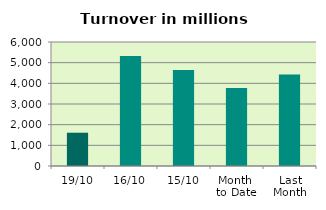
| Category | Series 0 |
|---|---|
| 19/10 | 1610.449 |
| 16/10 | 5327.782 |
| 15/10 | 4645.645 |
| Month 
to Date | 3777.999 |
| Last
Month | 4425.778 |